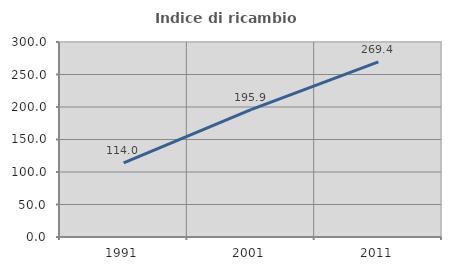
| Category | Indice di ricambio occupazionale  |
|---|---|
| 1991.0 | 114 |
| 2001.0 | 195.902 |
| 2011.0 | 269.355 |